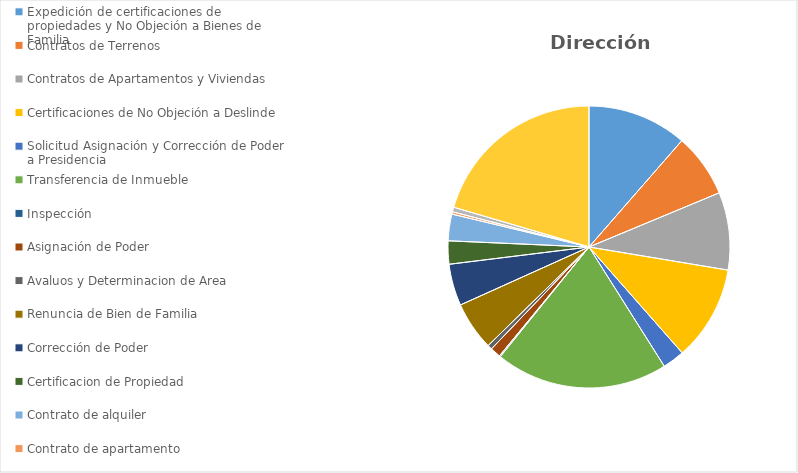
| Category | Series 0 |
|---|---|
| Expedición de certificaciones de propiedades y No Objeción a Bienes de Familia | 86 |
| Contratos de Terrenos  | 55 |
| Contratos de Apartamentos y Viviendas  | 67 |
| Certificaciones de No Objeción a Deslinde | 82 |
| Solicitud Asignación y Corrección de Poder a Presidencia | 19 |
| Transferencia de Inmueble | 149 |
| Inspección | 1 |
| Asignación de Poder | 9 |
| Avaluos y Determinacion de Area | 4 |
| Renuncia de Bien de Familia | 42 |
| Corrección de Poder | 36 |
| Certificacion de Propiedad | 20 |
| Contrato de alquiler | 23 |
| Contrato de apartamento | 2 |
| Regularizacion  | 4 |
| Estatud juridico | 154 |